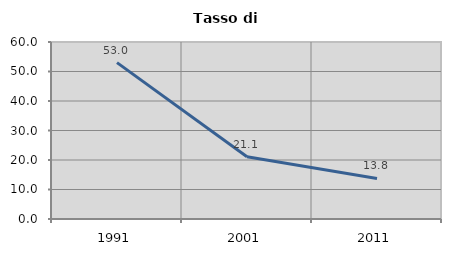
| Category | Tasso di disoccupazione   |
|---|---|
| 1991.0 | 53.009 |
| 2001.0 | 21.093 |
| 2011.0 | 13.758 |